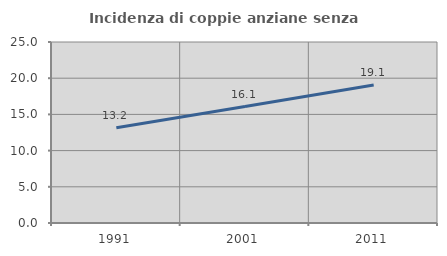
| Category | Incidenza di coppie anziane senza figli  |
|---|---|
| 1991.0 | 13.158 |
| 2001.0 | 16.08 |
| 2011.0 | 19.075 |